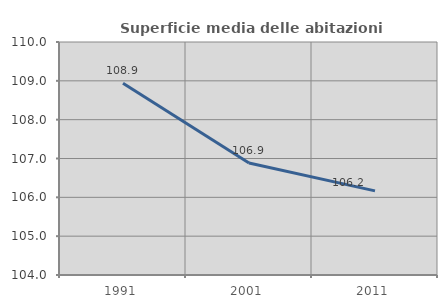
| Category | Superficie media delle abitazioni occupate |
|---|---|
| 1991.0 | 108.936 |
| 2001.0 | 106.884 |
| 2011.0 | 106.166 |